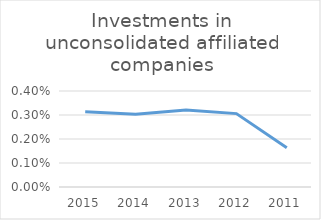
| Category | Investments in unconsolidated affiliated companies |
|---|---|
| 2015.0 | 0.003 |
| 2014.0 | 0.003 |
| 2013.0 | 0.003 |
| 2012.0 | 0.003 |
| 2011.0 | 0.002 |